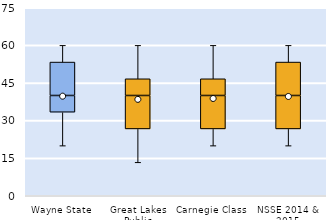
| Category | 25th | 50th | 75th |
|---|---|---|---|
| Wayne State | 33.333 | 6.667 | 13.333 |
| Great Lakes Public | 26.667 | 13.333 | 6.667 |
| Carnegie Class | 26.667 | 13.333 | 6.667 |
| NSSE 2014 & 2015 | 26.667 | 13.333 | 13.333 |